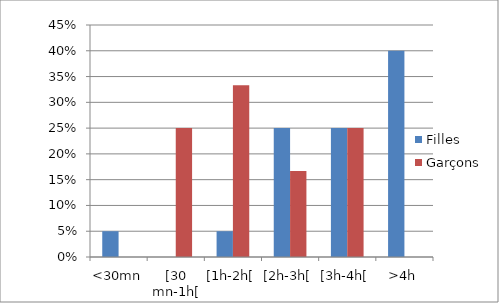
| Category | Filles | Garçons |
|---|---|---|
| <30mn | 0.05 | 0 |
| [30 mn-1h[ | 0 | 0.25 |
| [1h-2h[ | 0.05 | 0.333 |
| [2h-3h[ | 0.25 | 0.167 |
| [3h-4h[ | 0.25 | 0.25 |
| >4h | 0.4 | 0 |